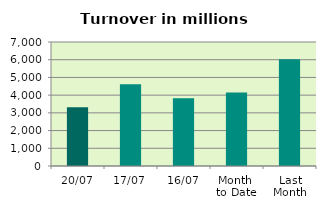
| Category | Series 0 |
|---|---|
| 20/07 | 3312.776 |
| 17/07 | 4609.185 |
| 16/07 | 3829.456 |
| Month 
to Date | 4144.329 |
| Last
Month | 6026.772 |